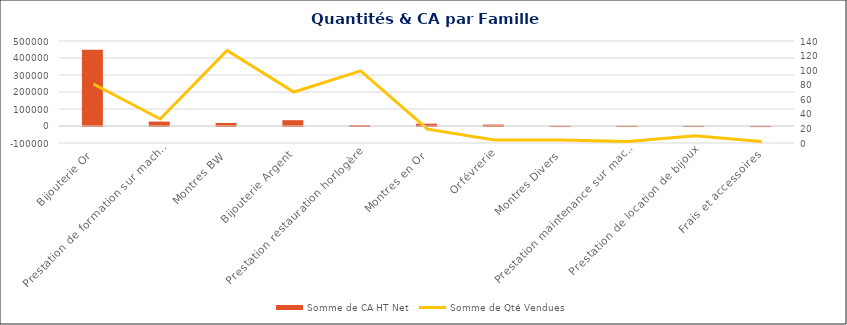
| Category | Somme de CA HT Net |
|---|---|
| Bijouterie Or | 448393.07 |
| Prestation de formation sur machine | 25819.36 |
| Montres BW | 17856.43 |
| Bijouterie Argent | 34206.96 |
| Prestation restauration horlogère | 5058.99 |
| Montres en Or | 13627.17 |
| Orfévrerie | 8136.32 |
| Montres Divers | 855.6 |
| Prestation maintenance sur machines | 1180 |
| Prestation de location de bijoux | 783.48 |
| Frais et accessoires | -329.39 |